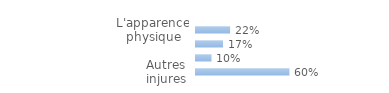
| Category | Series 0 |
|---|---|
| L'apparence physique | 0.218 |
| Les compétences | 0.173 |
| Les origines | 0.099 |
| Autres injures | 0.597 |